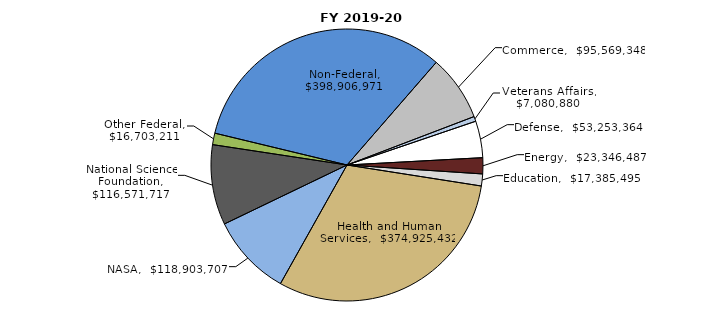
| Category | Series 0 |
|---|---|
| Commerce | 95569348 |
| Veterans Affairs | 7080880 |
| Defense | 53253364 |
| Energy | 23346487 |
| Education | 17385495 |
| Health and Human Services | 374925432 |
| NASA | 118903707 |
| National Science Foundation | 116571717 |
| Other Federal | 16703211 |
| Non-Federal | 398906971 |